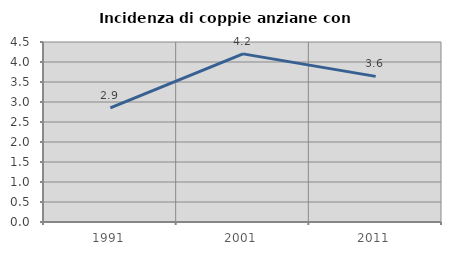
| Category | Incidenza di coppie anziane con figli |
|---|---|
| 1991.0 | 2.85 |
| 2001.0 | 4.203 |
| 2011.0 | 3.641 |